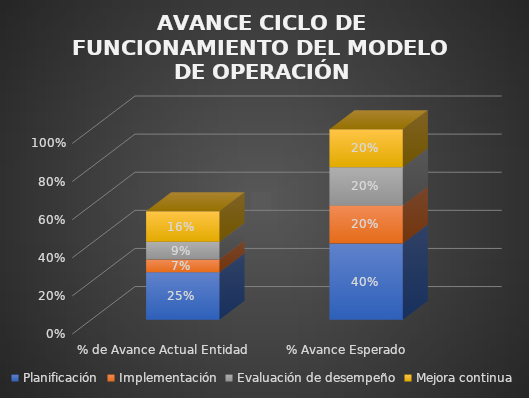
| Category | Planificación | Implementación | Evaluación de desempeño | Mejora continua |
|---|---|---|---|---|
| % de Avance Actual Entidad | 0.249 | 0.067 | 0.093 | 0.16 |
| % Avance Esperado | 0.4 | 0.2 | 0.2 | 0.2 |